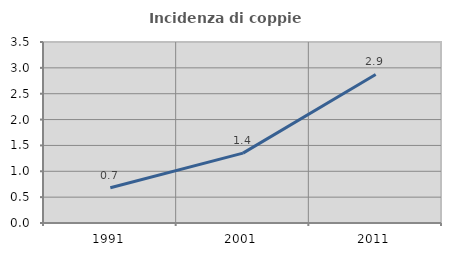
| Category | Incidenza di coppie miste |
|---|---|
| 1991.0 | 0.682 |
| 2001.0 | 1.351 |
| 2011.0 | 2.872 |